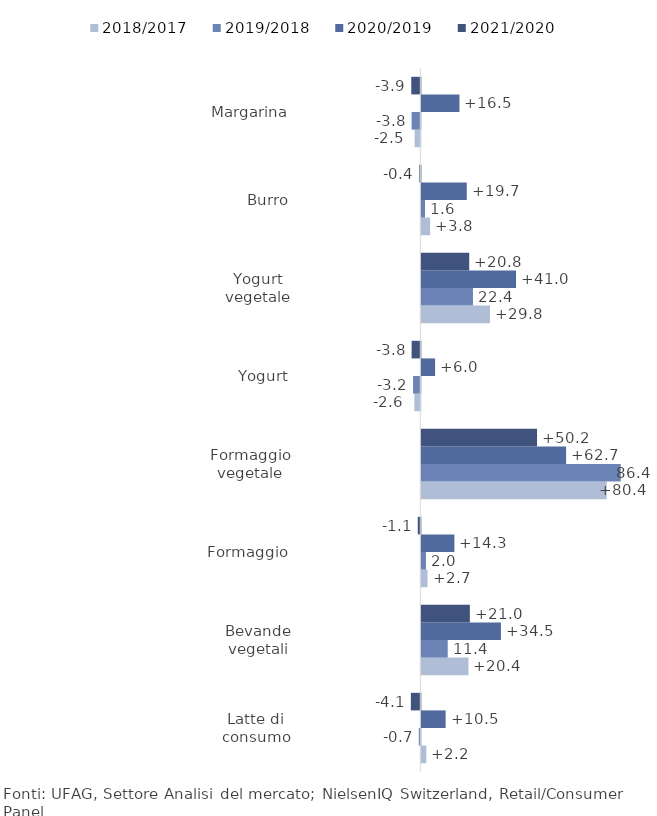
| Category | 2018/2017 | 2019/2018 | 2020/2019 | 2021/2020 |
|---|---|---|---|---|
| Latte di consumo | 2.164 | -0.687 | 10.537 | -4.114 |
| Bevande vegetali | 20.445 | 11.443 | 34.506 | 21.036 |
| Formaggio | 2.682 | 2.01 | 14.33 | -1.113 |
| Formaggio vegetale | 80.364 | 86.45 | 62.75 | 50.168 |
| Yogurt | -2.602 | -3.164 | 5.965 | -3.786 |
| Yogurt vegetale | 29.773 | 22.391 | 41.049 | 20.762 |
| Burro | 3.815 | 1.594 | 19.711 | -0.439 |
| Margarina | -2.473 | -3.778 | 16.541 | -3.929 |